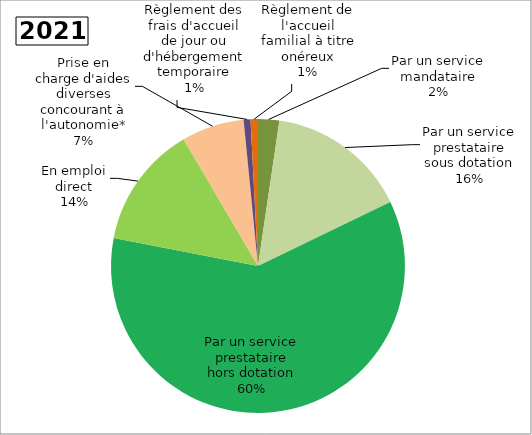
| Category | Series 0 |
|---|---|
| Par un service mandataire | 0.023 |
| Par un service prestataire sous dotation | 0.155 |
| Par un service prestataire hors dotation | 0.602 |
| En emploi direct | 0.135 |
| Prise en charge d'aides diverses concourant à l'autonomie* | 0.069 |
| Règlement des frais d'accueil de jour ou d'hébergement temporaire | 0.008 |
| Règlement de l'accueil familial à titre onéreux | 0.008 |